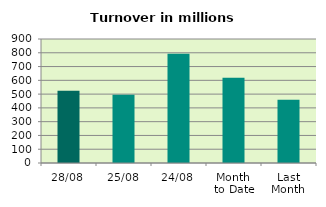
| Category | Series 0 |
|---|---|
| 28/08 | 524.128 |
| 25/08 | 495.869 |
| 24/08 | 793.271 |
| Month 
to Date | 618.449 |
| Last
Month | 458.733 |